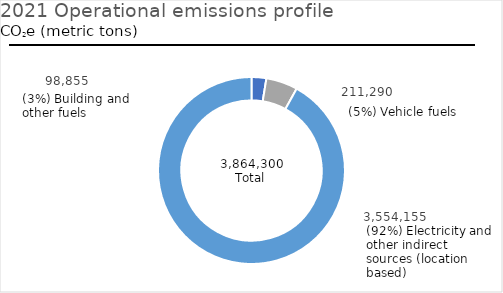
| Category | Series 0 |
|---|---|
| Building and other fuels | 98855.422 |
| Vehicle fuels | 211290.051 |
| Electricity and other indirect sources (Location Based) | 3554154.553 |